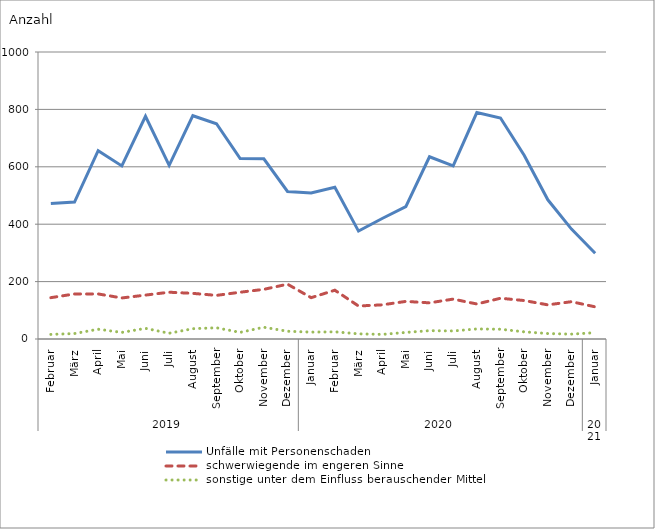
| Category | Unfälle mit Personenschaden | schwerwiegende im engeren Sinne | sonstige unter dem Einfluss berauschender Mittel |
|---|---|---|---|
| 0 | 472 | 144 | 16 |
| 1 | 477 | 157 | 19 |
| 2 | 656 | 157 | 34 |
| 3 | 603 | 143 | 23 |
| 4 | 776 | 153 | 37 |
| 5 | 605 | 163 | 20 |
| 6 | 778 | 159 | 36 |
| 7 | 750 | 152 | 39 |
| 8 | 629 | 163 | 23 |
| 9 | 628 | 173 | 41 |
| 10 | 514 | 191 | 27 |
| 11 | 509 | 144 | 24 |
| 12 | 529 | 170 | 25 |
| 13 | 376 | 115 | 18 |
| 14 | 420 | 119 | 16 |
| 15 | 461 | 131 | 23 |
| 16 | 635 | 126 | 29 |
| 17 | 603 | 139 | 28 |
| 18 | 789 | 122 | 35 |
| 19 | 770 | 142 | 34 |
| 20 | 640 | 134 | 25 |
| 21 | 485 | 119 | 19 |
| 22 | 383 | 130 | 17 |
| 23 | 299 | 112 | 22 |